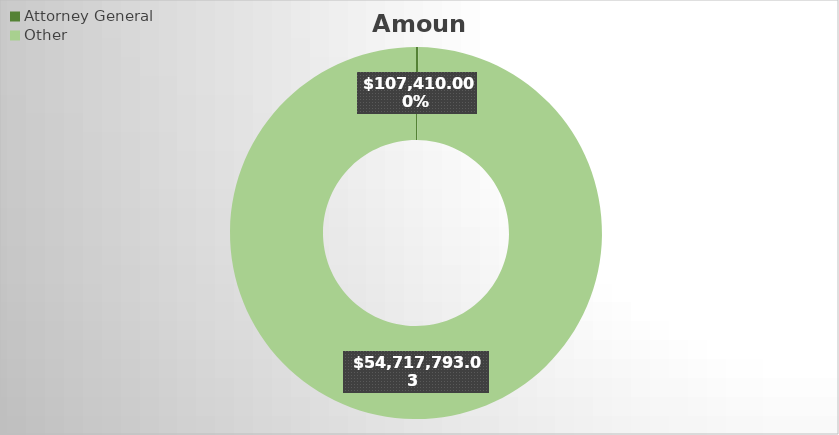
| Category | Amount |
|---|---|
| Attorney General | 107410 |
| Other | 54717793.03 |